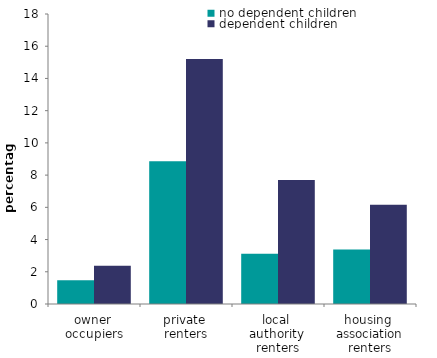
| Category | no dependent children | dependent children |
|---|---|---|
| owner 
occupiers | 1.475 | 2.373 |
| private 
renters | 8.86 | 15.201 |
| local 
authority 
renters | 3.118 | 7.693 |
| housing 
association renters | 3.382 | 6.155 |